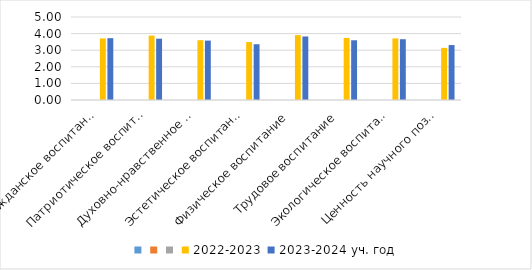
| Category | Series 0 | Series 1 | Series 2 | 2022-2023 | 2023-2024 уч. год |
|---|---|---|---|---|---|
| Гражданское воспитание |  |  |  | 3.71 | 3.725 |
| Патриотическое воспитание |  |  |  | 3.88 | 3.695 |
| Духовно-нравственное воспитание |  |  |  | 3.6 | 3.578 |
| Эстетическое воспитания |  |  |  | 3.49 | 3.36 |
| Физическое воспитание |  |  |  | 3.91 | 3.827 |
| Трудовое воспитание |  |  |  | 3.74 | 3.598 |
| Экологическое воспитание |  |  |  | 3.71 | 3.662 |
| Ценность научного познания |  |  |  | 3.14 | 3.31 |